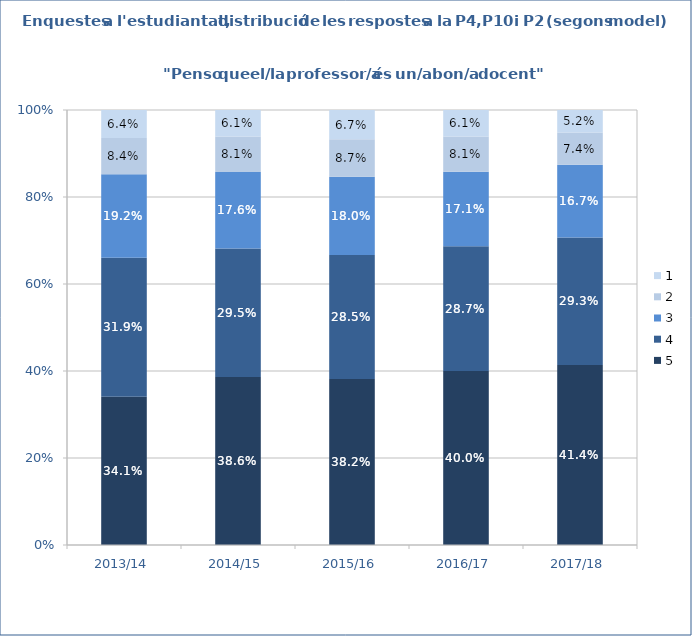
| Category | 5 | 4 | 3 | 2 | 1 |
|---|---|---|---|---|---|
| 2013/14 | 0.341 | 0.319 | 0.192 | 0.084 | 0.064 |
| 2014/15 | 0.386 | 0.295 | 0.176 | 0.081 | 0.061 |
| 2015/16 | 0.382 | 0.285 | 0.18 | 0.087 | 0.067 |
| 2016/17 | 0.4 | 0.287 | 0.171 | 0.081 | 0.061 |
| 2017/18 | 0.414 | 0.293 | 0.167 | 0.074 | 0.052 |